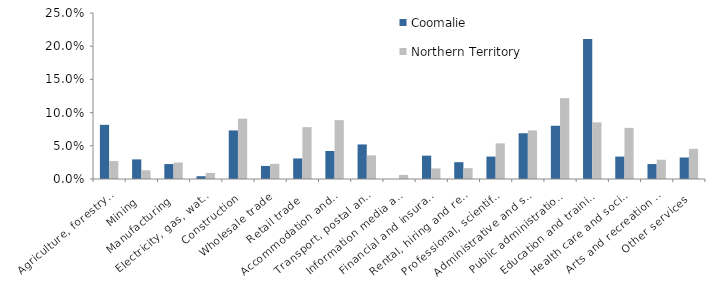
| Category | Coomalie | Northern Territory |
|---|---|---|
| Agriculture, forestry and fishing | 0.082 | 0.027 |
| Mining | 0.03 | 0.013 |
| Manufacturing | 0.023 | 0.025 |
| Electricity, gas, water and waste services | 0.004 | 0.009 |
| Construction | 0.073 | 0.091 |
| Wholesale trade | 0.02 | 0.023 |
| Retail trade | 0.031 | 0.078 |
| Accommodation and food services | 0.042 | 0.089 |
| Transport, postal and warehousing | 0.052 | 0.036 |
| Information media and telecommunications | 0 | 0.006 |
| Financial and insurance services | 0.035 | 0.016 |
| Rental, hiring and real estate services | 0.025 | 0.016 |
| Professional, scientific and technical services | 0.034 | 0.054 |
| Administrative and support services | 0.069 | 0.073 |
| Public administration and safety | 0.08 | 0.122 |
| Education and training | 0.211 | 0.085 |
| Health care and social assistance | 0.034 | 0.077 |
| Arts and recreation services | 0.023 | 0.029 |
| Other services | 0.032 | 0.045 |